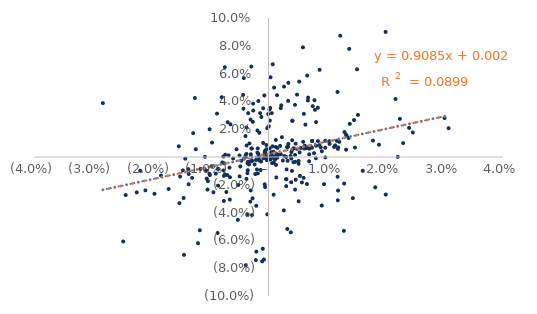
| Category | Series 0 |
|---|---|
| -0.00013591470597107413 | 0.001 |
| 0.008118231660348307 | 0.008 |
| 0.0016330444292957935 | 0.001 |
| 0.0008750215015969065 | -0.027 |
| 0.009691544370385774 | 0 |
| 0.0030564292321926256 | -0.016 |
| 0.00514246927061035 | -0.003 |
| -0.005149190736594811 | -0.02 |
| 0.006422766327144114 | 0.006 |
| 0.015259816427670714 | 0.03 |
| 0.00672272548389552 | 0.041 |
| -0.0005845793001546529 | -0.022 |
| -0.0009078838769870368 | 0.01 |
| 0.0008871584709266855 | -0.004 |
| 0.011364941291304387 | 0.008 |
| -0.004623338099783103 | -0.003 |
| 0.004017424285632787 | 0.005 |
| -0.0016367541850846878 | 0 |
| 0.0006756900929607568 | 0.008 |
| 0.012235948028316956 | 0.087 |
| 0.004005940448061462 | -0.01 |
| 0.016078722094779785 | -0.01 |
| -0.0012630521120847726 | -0.003 |
| 0.0007201954520863474 | 0.067 |
| 0.004056362083689091 | 0.026 |
| 0.0038993641670039825 | 0.004 |
| -0.007976824506444657 | 0.043 |
| 0.00947353196413081 | -0.02 |
| 0.00015009944087962523 | -0.002 |
| -0.005457342342495952 | 0.006 |
| 0.015096902082768926 | 0.063 |
| -0.0027264895180497684 | -0.03 |
| -0.0010874794191979564 | -0.075 |
| -0.005222870747514818 | -0.045 |
| 0.008117497451562539 | 0.025 |
| 0.002289498068975826 | 0.014 |
| 0.0008131590046391857 | 0 |
| 0.006945006338161308 | 0.006 |
| -0.006652693889030448 | -0.008 |
| 0.007442136378497333 | 0.011 |
| -0.004275720398665639 | 0.035 |
| -0.008638561382169896 | -0.009 |
| -0.013611344594777641 | -0.012 |
| 0.00871725445999072 | 0.063 |
| 0.01183026818226729 | -0.031 |
| 0.006032816908046579 | 0.031 |
| -0.001566086857586635 | 0.017 |
| 0.01884262952213067 | 0.009 |
| 0.0002796163006433261 | 0.035 |
| 0.005143501724914845 | -0.032 |
| -0.000363175924380732 | 0.006 |
| 0.007547639153459906 | 0.037 |
| -0.0013546349957120896 | -0.009 |
| 0.00038059300944981445 | -0.002 |
| -0.0039020329591717973 | 0.001 |
| 0.001501638744891176 | 0 |
| 0.017813371926256316 | 0.012 |
| -0.0007109528369260154 | 0.044 |
| -0.0049321390228660444 | -0.014 |
| -0.003091827269916414 | -0.032 |
| -0.001224413315414119 | 0.029 |
| 0.00909893678616358 | 0.004 |
| -0.001964932525563179 | -0.009 |
| -0.01460702666071434 | -0.01 |
| 0.004044861786974829 | 0.012 |
| -0.010848888167505288 | 0 |
| -0.018332305026451667 | -0.013 |
| 0.008438028630458616 | 0.011 |
| 0.01295889884168866 | 0.018 |
| -0.01447202631277511 | -0.029 |
| -0.007614575619410702 | -0.032 |
| 0.018210413599250463 | -0.022 |
| -0.0037366653301871278 | 0.008 |
| -0.007880717148559313 | -0.004 |
| -0.002364042612616246 | -0.005 |
| -0.009998500224966289 | -0.013 |
| -0.0029793465636519523 | 0 |
| 0.022970691518098496 | 0.01 |
| 0.006924938028736172 | -0.003 |
| 0.006093863194574167 | 0.006 |
| -0.007441678613319347 | 0.065 |
| 0.001339303299675798 | -0.015 |
| 0.0030848008811843464 | -0.009 |
| -0.011618216579244112 | -0.009 |
| -0.02247131567635474 | -0.025 |
| 0.00048032364342387446 | 0.003 |
| -0.003884696527101661 | -0.078 |
| -0.003923605100686567 | 0.015 |
| -0.0003646016131066965 | 0.009 |
| 6.13572217451619e-05 | 0.022 |
| -0.010648233361283288 | -0.01 |
| -0.0030386759365805815 | -0.024 |
| -0.006814663275461763 | 0.001 |
| -0.020998315959416036 | -0.024 |
| -0.012403640770660584 | 0.006 |
| 0.02462222766024058 | 0.018 |
| -0.002855426891588686 | 0.006 |
| 0.003888583625681674 | -0.001 |
| -0.003768262388952004 | 0.002 |
| -0.0006515506906437096 | -0.02 |
| 0.011791945812026583 | -0.014 |
| -0.011713729410412266 | -0.053 |
| -0.0035314517720699268 | -0.004 |
| -0.028245630168285407 | 0.039 |
| 0.004560542751903762 | -0.003 |
| 0.0065579472538142 | -0.019 |
| 0.023976732382806842 | 0.021 |
| -0.0048159397058409326 | -0.007 |
| 0.009678490438075338 | 0.007 |
| -0.01703388585302379 | -0.023 |
| 0.011865908823979643 | -0.024 |
| -0.008603375928134094 | -0.021 |
| 0.00628678674949712 | 0.023 |
| 0.012858165305165592 | -0.053 |
| 0.007842522974101929 | 0.041 |
| 0.011891563310572506 | 0.007 |
| 0.00023551417180911471 | 0.026 |
| -0.024351208858707563 | -0.027 |
| 0.011657555376011208 | 0.012 |
| -0.01945084047268386 | -0.026 |
| 0.006311350558501738 | 0.006 |
| 0.007449037511475076 | 0.011 |
| -0.008983347940403341 | -0.012 |
| 0.030026425781455757 | 0.028 |
| 0.005512682918519252 | 0.007 |
| 0.00842021801079551 | 0.035 |
| 1.3440498911387877e-05 | 0 |
| -0.01303374863916773 | -0.015 |
| -0.0018928755025822142 | 0.019 |
| -0.010041715414237817 | 0.02 |
| -0.004944303370051029 | 0.001 |
| -0.0075450661015658005 | -0.005 |
| 0.014751290040088127 | 0.007 |
| -0.00396428362678658 | 0 |
| 0.0045220128825589345 | 0.038 |
| 0.011188849637805642 | 0.007 |
| 0.007918167606878246 | 0.034 |
| -0.013688930847297609 | -0.009 |
| -0.0120158616210303 | -0.062 |
| -0.009397436119232716 | -0.025 |
| -0.00305624539380156 | 0.027 |
| 0.013667386064241338 | 0.014 |
| 0.022410783720729244 | 0.027 |
| -0.0041411856975277495 | -0.001 |
| -0.002145398256524489 | -0.002 |
| -0.006569099716960514 | -0.015 |
| -0.0035750853534507465 | -0.005 |
| 0.01997752399674213 | 0.09 |
| 0.007416018059907659 | 0.007 |
| 0.008679191012438636 | 0.009 |
| -0.0015285855444219232 | -0.003 |
| 0.0024541303445413387 | -0.003 |
| 0.0007354305250046878 | 0.001 |
| 0.0005495123905112642 | 0.003 |
| -0.0018329076399824507 | -0.012 |
| 0.004623829127140322 | 0.01 |
| 0.010379652449908017 | 0.011 |
| 0.004636901243799896 | -0.016 |
| -0.00012351337032234788 | 0 |
| -0.0029094242590720354 | 0.006 |
| 0.0020898130579083407 | 0.035 |
| -0.006594722270120035 | -0.031 |
| 0.005367786729547186 | -0.014 |
| 0.001107567618632066 | -0.002 |
| 0.001285309401631407 | -0.006 |
| 0.001316157210916602 | 0.002 |
| -0.010541381738873534 | -0.016 |
| 0.005986138399519669 | -0.015 |
| 0.002641051725486898 | 0.051 |
| -0.0018828900899493517 | 0.003 |
| 0.021679422142724336 | 0.042 |
| 0.0001945270918839448 | 0 |
| -0.010330249137551761 | -0.017 |
| 0.00016430306505754722 | 0.034 |
| 0.0031502353013177498 | 0.007 |
| 0.013332006126557827 | 0.015 |
| 0.008910492643773527 | 0.007 |
| -0.0016583174987042648 | -0.002 |
| -0.00027369937741250627 | -0.002 |
| 0.0015167726099816203 | 0.007 |
| -0.0020926155180321926 | -0.035 |
| 0.0012594617060668334 | 0 |
| -0.006031522409086887 | -0.001 |
| -0.013620055809009268 | -0.02 |
| -0.007707530799652362 | 0 |
| 0.013866890778032825 | 0.024 |
| -0.006494293183702093 | 0.024 |
| -0.0008664315535117373 | -0.001 |
| 0.002090874345196614 | 0.002 |
| 0.004868527326572725 | 0.045 |
| 0.004538741974273064 | -0.023 |
| -0.004213420713392146 | 0.057 |
| -0.007601580261400009 | -0.014 |
| -0.015207158577923319 | -0.033 |
| -0.004319710801234389 | 0.045 |
| -0.0007765959538369449 | -0.074 |
| -0.0017380411292675646 | 0.04 |
| 0.00659306004053728 | 0.059 |
| 0.012071745132466116 | 0.011 |
| 0.0009512538815996674 | 0.05 |
| -0.01006726544076908 | -0.012 |
| -0.021885078119152523 | -0.01 |
| 0.0037729320406438838 | 0.001 |
| -0.008783676283411035 | 0.031 |
| -0.002929315222407358 | 0.065 |
| 0.001482375825871074 | 0.001 |
| 0.0006128353850480828 | -0.004 |
| -0.0035877441054903425 | -0.042 |
| 0.014385855308457929 | -0.03 |
| -0.012559353125434547 | 0.042 |
| 0.0058783486970721555 | 0.079 |
| 0.004090463585873172 | 0.026 |
| -0.02478145242419305 | -0.061 |
| -0.014200164096837664 | -0.001 |
| 0.003208338225847873 | -0.052 |
| -0.00021343468038170776 | 0.021 |
| -0.007010415769992284 | -0.013 |
| -0.012857633266178614 | 0.017 |
| -0.003467038544897605 | 0.032 |
| 0.005706853158685021 | -0.018 |
| 0.022059983246469628 | 0 |
| 0.00020918565054994787 | 0.006 |
| 0.0033839845303567095 | 0.009 |
| 0.013770480600023838 | 0.078 |
| 0.003346984175135459 | 0.04 |
| -0.0030200417901223853 | 0.002 |
| 0.008083456039679415 | -0.001 |
| 0.0067685458155344325 | 0.007 |
| -0.0005942835894728882 | 0.004 |
| -0.0026708833847135516 | 0.025 |
| -0.0018353207647724412 | 0.006 |
| -0.00767179788366501 | -0.01 |
| 0.005235901402293575 | 0.054 |
| -0.003756770047536717 | 0.021 |
| 0.0029952586264792025 | -0.016 |
| 0.011831427270535988 | 0.006 |
| -0.0028091188829699743 | -0.042 |
| -0.007183598169758554 | -0.025 |
| -0.0069615261215977275 | 0.025 |
| 0.0132163038100781 | 0.016 |
| 0.014591775725769196 | 0.027 |
| -0.00332948113130338 | -0.005 |
| 0.0019807118737600327 | 0.008 |
| -0.009631555309321027 | 0.01 |
| -0.002783837193521377 | -0.003 |
| -0.0074487153953396446 | -0.012 |
| -0.0014213286245552403 | 0.032 |
| -0.00857360067785029 | -0.009 |
| 0.019997905624749013 | -0.027 |
| 0.030716904398395695 | 0.021 |
| -0.003756112921156962 | -0.016 |
| 0.00035154826370620285 | 0.057 |
| -0.0009188628024993095 | 0.035 |
| -0.0022589316544092686 | -0.012 |
| 0.004528091959079106 | 0.002 |
| 0.005135536301319021 | -0.005 |
| 0.0012396853057250468 | 0.012 |
| -0.0026010756231543697 | 0.033 |
| -0.0021555733761026152 | -0.074 |
| 0.002173088421553393 | 0.037 |
| 0.005921335411895212 | 0.011 |
| -0.00041135204081632626 | 0.002 |
| 0.002702004332139074 | 0.001 |
| 0.0033373844323265622 | 0.007 |
| -0.0073850466282140426 | 0.002 |
| 0.006174969173071476 | 0.008 |
| 0.0014572770191543238 | 0.044 |
| -0.00020289763180425524 | -0.041 |
| -0.0035989929161672762 | -0.012 |
| -5.728269966998045e-05 | 0.031 |
| 0.011765904020520912 | 0.047 |
| -0.01507659400459238 | -0.014 |
| 0.012905718948508005 | -0.019 |
| -0.000977430807357904 | -0.066 |
| -0.0010572892996010275 | 0.001 |
| 0.009080195758151888 | -0.035 |
| -0.0005854965919088739 | -0.001 |
| -0.0017261904761904923 | 0.002 |
| 0.0032606410188014134 | -0.003 |
| 0.000556792873051215 | 0.032 |
| -0.002072742961114926 | -0.068 |
| 0.006754322484437747 | 0.043 |
| -0.01530375685759544 | 0.008 |
| -0.010403203124753069 | -0.023 |
| 0.009685485184369291 | 0.012 |
| -0.014412585156650448 | -0.07 |
| 0.0043000401123145515 | 0.006 |
| 0.010419695493106396 | 0.009 |
| -0.000654595131330149 | 0.003 |
| 0.003021970197994328 | -0.021 |
| 0.0038772896199690265 | -0.018 |
| 0.013230547794961023 | 0.005 |
| -0.0005458836957568103 | 0.003 |
| 0.0030164133851793284 | 0 |
| 0.0037993991503948443 | -0.054 |
| 0.002619923128373225 | -0.038 |
| -0.0032432897718015496 | 0.01 |
| 0.0008635791655358105 | 0.004 |
| 0.0042556207474608865 | -0.004 |
| -0.0030255329203141557 | -0.003 |
| -0.0035333187650620212 | -0.01 |
| -0.0026223209238971368 | 0.038 |
| 0.007769966863832023 | 0.003 |
| -0.009707484811888656 | -0.007 |
| 0.006950909203748523 | 0.002 |
| -0.0029892141756547863 | -0.003 |
| 0.005310172163323301 | 0.003 |
| 0.0012421290830382237 | 0.007 |
| 0.003377838920074261 | 0.053 |
| -0.008676304965233528 | -0.055 |
| 0.004843833451161794 | 0.006 |